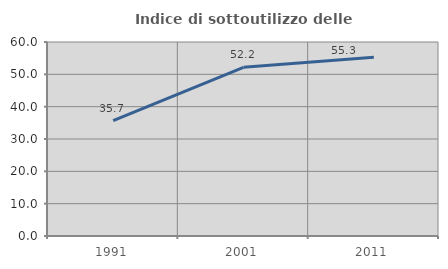
| Category | Indice di sottoutilizzo delle abitazioni  |
|---|---|
| 1991.0 | 35.659 |
| 2001.0 | 52.174 |
| 2011.0 | 55.273 |